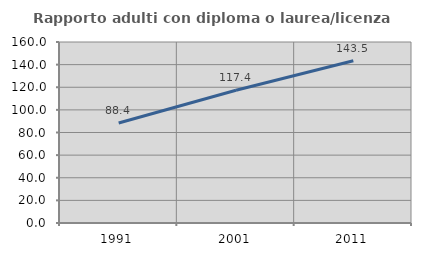
| Category | Rapporto adulti con diploma o laurea/licenza media  |
|---|---|
| 1991.0 | 88.388 |
| 2001.0 | 117.394 |
| 2011.0 | 143.456 |